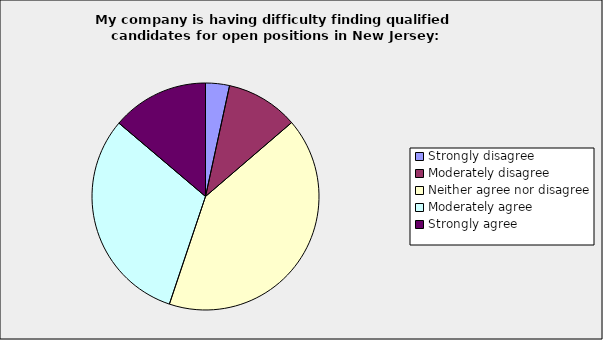
| Category | Series 0 |
|---|---|
| Strongly disagree | 0.034 |
| Moderately disagree | 0.103 |
| Neither agree nor disagree | 0.414 |
| Moderately agree | 0.31 |
| Strongly agree | 0.138 |